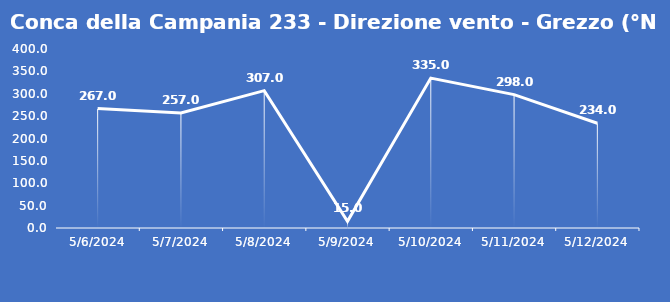
| Category | Conca della Campania 233 - Direzione vento - Grezzo (°N) |
|---|---|
| 5/6/24 | 267 |
| 5/7/24 | 257 |
| 5/8/24 | 307 |
| 5/9/24 | 15 |
| 5/10/24 | 335 |
| 5/11/24 | 298 |
| 5/12/24 | 234 |